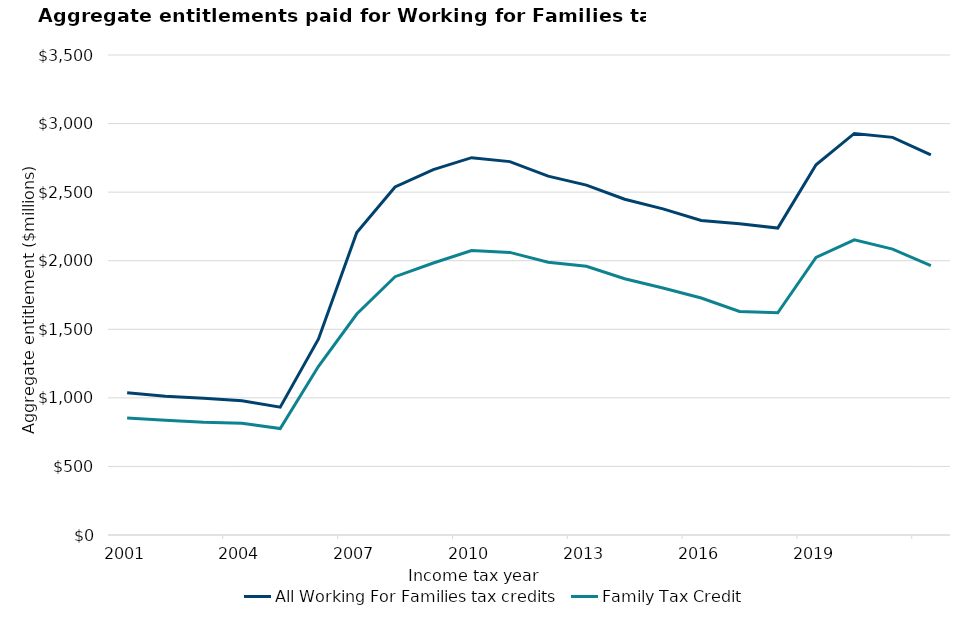
| Category | All Working For Families tax credits | Family Tax Credit |
|---|---|---|
| 2001-03-01 | 1037.1 | 852.9 |
| 2002-03-01 | 1012.6 | 836.4 |
| 2003-03-01 | 997.3 | 821.9 |
| 2004-03-01 | 978.4 | 814.9 |
| 2005-03-01 | 932.2 | 775.9 |
| 2006-03-01 | 1429.7 | 1230.2 |
| 2007-03-01 | 2204.9 | 1611.3 |
| 2008-03-01 | 2537.7 | 1883.5 |
| 2009-03-01 | 2664.4 | 1983.5 |
| 2010-03-01 | 2751.4 | 2073.8 |
| 2011-03-01 | 2722.5 | 2060.5 |
| 2012-03-01 | 2616.5 | 1988.9 |
| 2013-03-01 | 2551.2 | 1959.7 |
| 2014-03-01 | 2448.2 | 1868.7 |
| 2015-03-01 | 2378.1 | 1801.6 |
| 2016-03-01 | 2293.1 | 1728 |
| 2017-03-01 | 2269.3 | 1630.1 |
| 2018-03-01 | 2237.941 | 1620.681 |
| 2019-03-01 | 2700 | 2024 |
| 2020-03-01 | 2928 | 2152 |
| 2021-03-01 | 2899.3 | 2084.2 |
| 2022-03-01 | 2771 | 1964 |